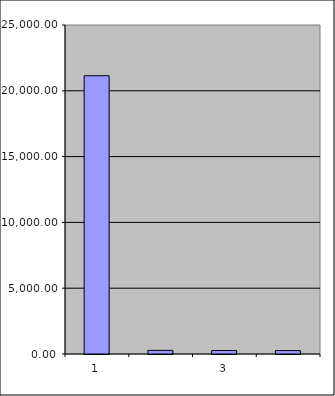
| Category | Series 0 |
|---|---|
| 0 | 21144 |
| 1 | 274.501 |
| 2 | 264.18 |
| 3 | 259.987 |